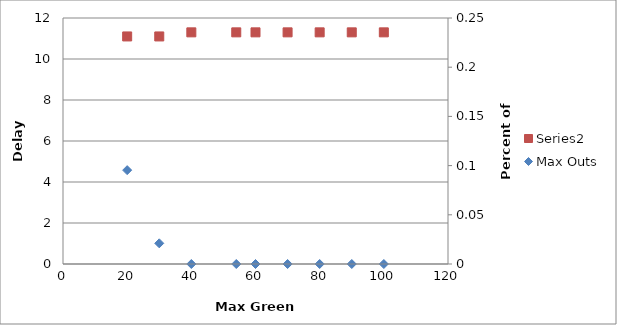
| Category | Series 1 |
|---|---|
| 100.0 | 11.3 |
| 90.0 | 11.3 |
| 80.0 | 11.3 |
| 70.0 | 11.3 |
| 60.0 | 11.3 |
| 54.0 | 11.3 |
| 40.0 | 11.3 |
| 30.0 | 11.1 |
| 20.0 | 11.1 |